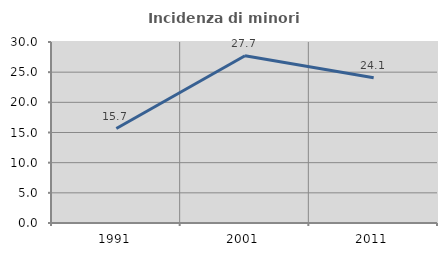
| Category | Incidenza di minori stranieri |
|---|---|
| 1991.0 | 15.663 |
| 2001.0 | 27.731 |
| 2011.0 | 24.058 |